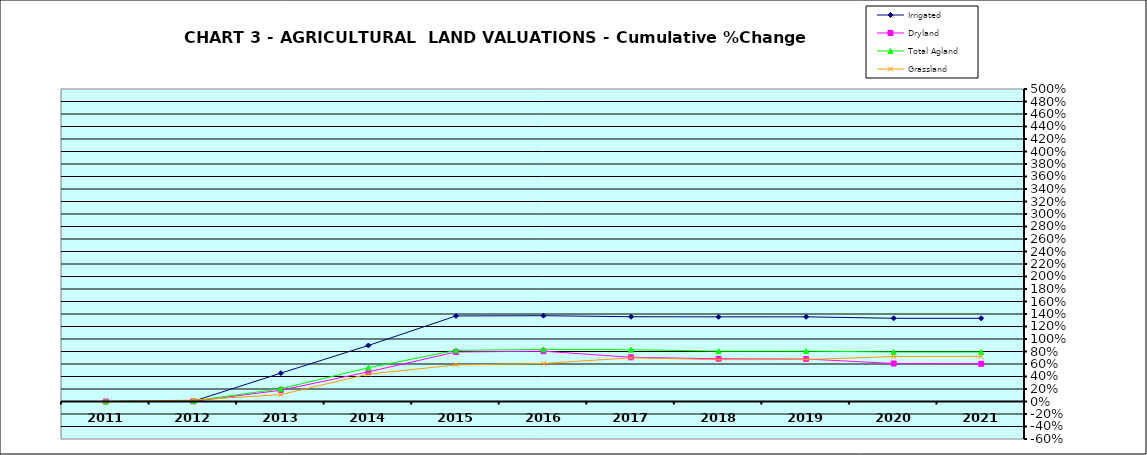
| Category | Irrigated | Dryland | Total Agland | Grassland |
|---|---|---|---|---|
| 2011.0 | 0 | 0 | 0 | 0 |
| 2012.0 | 0.004 | 0.002 | 0.011 | 0.022 |
| 2013.0 | 0.454 | 0.181 | 0.204 | 0.11 |
| 2014.0 | 0.897 | 0.474 | 0.541 | 0.439 |
| 2015.0 | 1.369 | 0.792 | 0.818 | 0.585 |
| 2016.0 | 1.373 | 0.805 | 0.833 | 0.608 |
| 2017.0 | 1.356 | 0.707 | 0.828 | 0.699 |
| 2018.0 | 1.354 | 0.683 | 0.806 | 0.669 |
| 2019.0 | 1.355 | 0.68 | 0.806 | 0.672 |
| 2020.0 | 1.331 | 0.608 | 0.792 | 0.719 |
| 2021.0 | 1.331 | 0.604 | 0.791 | 0.721 |